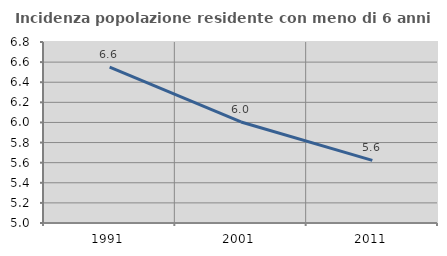
| Category | Incidenza popolazione residente con meno di 6 anni |
|---|---|
| 1991.0 | 6.551 |
| 2001.0 | 6.005 |
| 2011.0 | 5.623 |